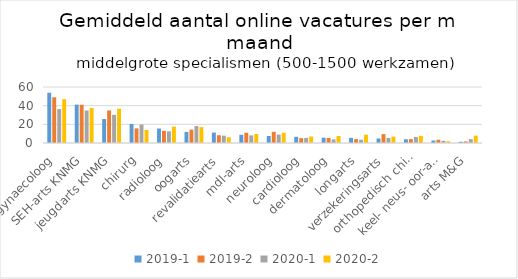
| Category | 2019-1 | 2019-2 | 2020-1 | 2020-2 |
|---|---|---|---|---|
| gynaecoloog | 53.833 | 49 | 36.333 | 47 |
| SEH-arts KNMG | 41.167 | 41 | 34.833 | 37.5 |
| jeugdarts KNMG | 25.667 | 34.833 | 30.167 | 36.667 |
| chirurg | 20.333 | 15.667 | 19.833 | 14 |
| radioloog | 15.5 | 13 | 12.5 | 17.5 |
| oogarts | 11.833 | 14.333 | 18.167 | 17 |
| revalidatiearts | 11.167 | 8.333 | 7.833 | 6.167 |
| mdl-arts | 8.833 | 11 | 8.167 | 9.667 |
| neuroloog | 7.5 | 12 | 9 | 11 |
| cardioloog | 6.667 | 5.167 | 5.5 | 7 |
| dermatoloog | 5.667 | 5.333 | 3.833 | 7.5 |
| longarts | 5.5 | 4.167 | 3.5 | 8.833 |
| verzekeringsarts | 4.833 | 9.5 | 5.5 | 6.833 |
| orthopedisch chirurg | 4 | 4.167 | 6.5 | 7.667 |
| keel- neus- oor-arts | 2.667 | 3.5 | 2.333 | 1.833 |
| arts M&G | 1.333 | 1.667 | 4.167 | 7.833 |